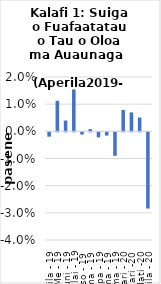
| Category | All items - m-m changes |
|---|---|
| Aperila - 19 | -0.002 |
| Me - 19 | 0.011 |
| Iuni - 19 | 0.004 |
| Iulai - 19 | 0.015 |
| Aukuso - 19 | -0.001 |
| Setema - 19 | 0.001 |
| Oketopa - 19 | -0.002 |
| Novema - 19 | -0.001 |
| Tesema - 19 | -0.009 |
| Ianuari - 20 | 0.008 |
| Fepuari -20 | 0.007 |
| Mati -20 | 0.005 |
| Aperila - 20 | -0.028 |